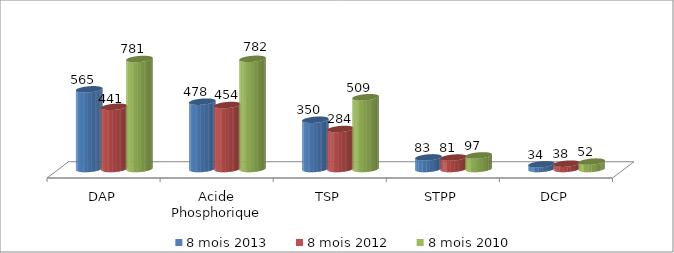
| Category | 8 mois 2013 | 8 mois 2012 | 8 mois 2010 |
|---|---|---|---|
| DAP | 565.434 | 441.328 | 780.6 |
| Acide Phosphorique 54% | 477.806 | 454.029 | 781.785 |
| TSP | 349.668 | 283.97 | 509.13 |
| STPP | 82.514 | 81.18 | 96.63 |
| DCP | 33.59 | 37.91 | 52.38 |